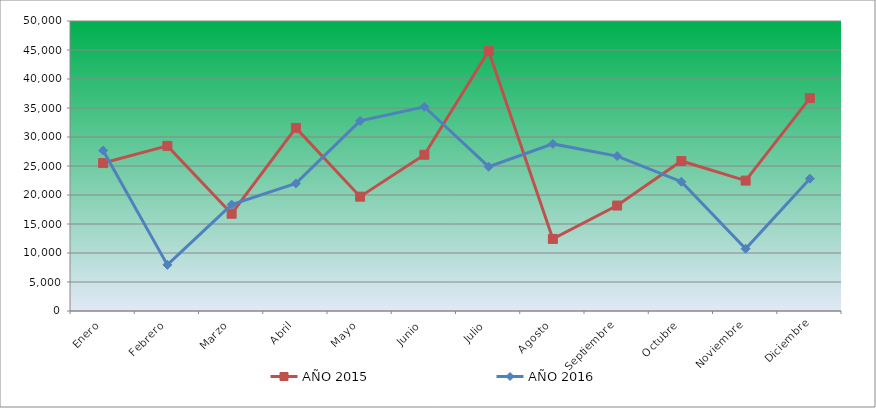
| Category | AÑO 2015 | AÑO 2016 |
|---|---|---|
| Enero | 25507.808 | 27670.419 |
| Febrero | 28472.919 | 7953.527 |
| Marzo | 16769.568 | 18342.208 |
| Abril | 31575.486 | 21994.939 |
| Mayo | 19715.042 | 32776.387 |
| Junio | 26941.273 | 35211.541 |
| Julio | 44830.12 | 24881.775 |
| Agosto | 12429.902 | 28809.442 |
| Septiembre | 18183.395 | 26708.14 |
| Octubre | 25861.265 | 22289.514 |
| Noviembre | 22483.788 | 10742.171 |
| Diciembre | 36700.611 | 22819.749 |